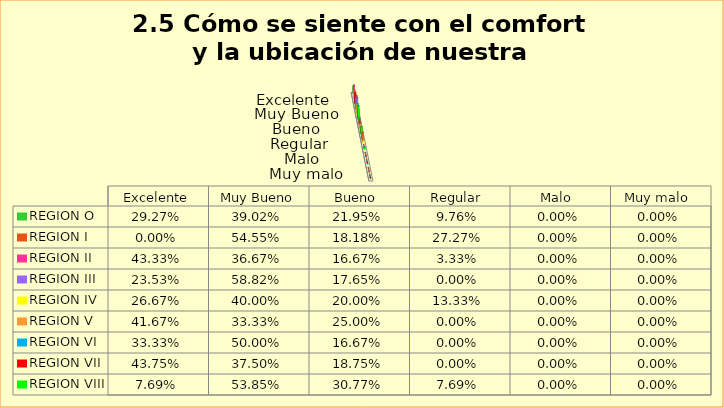
| Category | REGION O | REGION I  | REGION II | REGION III | REGION IV | REGION V  | REGION VI  | REGION VII  | REGION VIII |
|---|---|---|---|---|---|---|---|---|---|
| Excelente | 0.293 | 0 | 0.433 | 0.235 | 0.267 | 0.417 | 0.333 | 0.438 | 0.077 |
| Muy Bueno | 0.39 | 0.545 | 0.367 | 0.588 | 0.4 | 0.333 | 0.5 | 0.375 | 0.538 |
| Bueno  | 0.22 | 0.182 | 0.167 | 0.176 | 0.2 | 0.25 | 0.167 | 0.188 | 0.308 |
| Regular  | 0.098 | 0.273 | 0.033 | 0 | 0.133 | 0 | 0 | 0 | 0.077 |
| Malo  | 0 | 0 | 0 | 0 | 0 | 0 | 0 | 0 | 0 |
| Muy malo  | 0 | 0 | 0 | 0 | 0 | 0 | 0 | 0 | 0 |